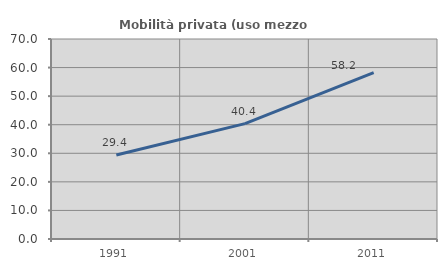
| Category | Mobilità privata (uso mezzo privato) |
|---|---|
| 1991.0 | 29.376 |
| 2001.0 | 40.385 |
| 2011.0 | 58.232 |